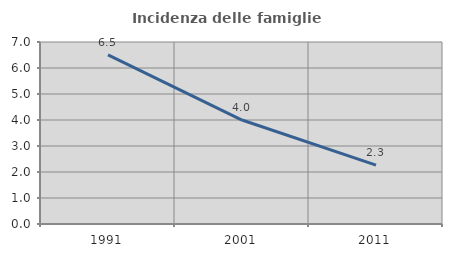
| Category | Incidenza delle famiglie numerose |
|---|---|
| 1991.0 | 6.503 |
| 2001.0 | 3.999 |
| 2011.0 | 2.266 |